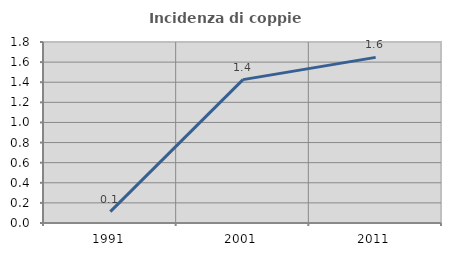
| Category | Incidenza di coppie miste |
|---|---|
| 1991.0 | 0.113 |
| 2001.0 | 1.426 |
| 2011.0 | 1.647 |